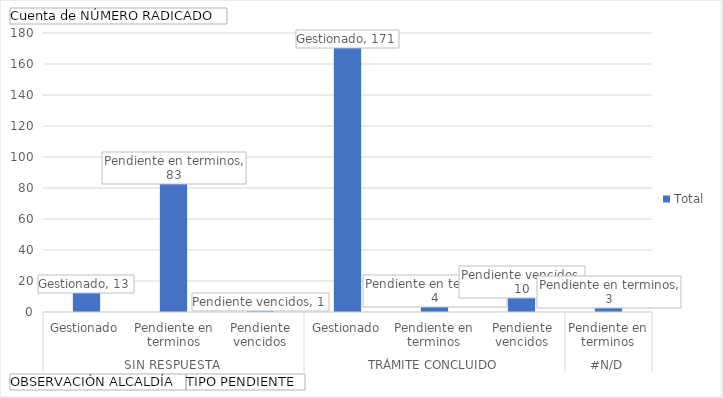
| Category | Total |
|---|---|
| 0 | 13 |
| 1 | 83 |
| 2 | 1 |
| 3 | 171 |
| 4 | 4 |
| 5 | 10 |
| 6 | 3 |